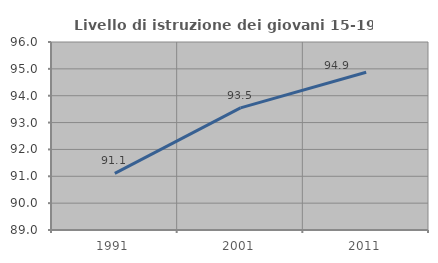
| Category | Livello di istruzione dei giovani 15-19 anni |
|---|---|
| 1991.0 | 91.111 |
| 2001.0 | 93.548 |
| 2011.0 | 94.872 |